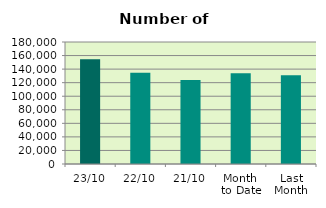
| Category | Series 0 |
|---|---|
| 23/10 | 154686 |
| 22/10 | 134774 |
| 21/10 | 123924 |
| Month 
to Date | 134042.941 |
| Last
Month | 130923.048 |